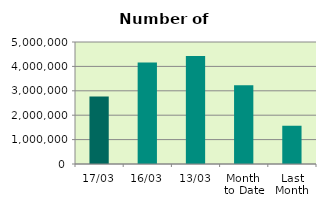
| Category | Series 0 |
|---|---|
| 17/03 | 2767412 |
| 16/03 | 4156926 |
| 13/03 | 4428082 |
| Month 
to Date | 3224396 |
| Last
Month | 1567888.4 |